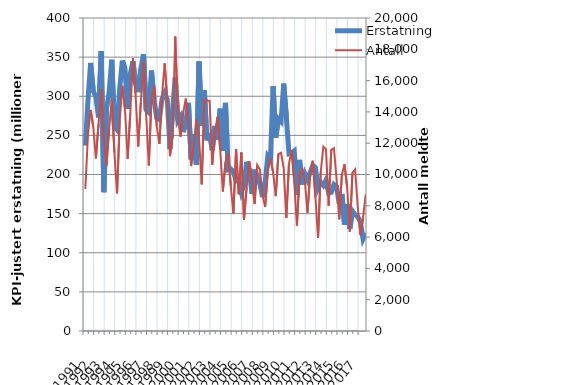
| Category | Erstatning |
|---|---|
| 1991.0 | 236.93 |
| nan | 294.783 |
| nan | 342.604 |
| nan | 306.85 |
| 1992.0 | 298.702 |
| nan | 272.93 |
| nan | 357.674 |
| nan | 177.392 |
| 1993.0 | 282.989 |
| nan | 304.909 |
| nan | 346.657 |
| nan | 261.754 |
| 1994.0 | 257.298 |
| nan | 309.812 |
| nan | 345.57 |
| nan | 335.26 |
| 1995.0 | 283.864 |
| nan | 328.377 |
| nan | 344.843 |
| nan | 315.774 |
| 1996.0 | 305.279 |
| nan | 335.126 |
| nan | 353.585 |
| nan | 282.683 |
| 1997.0 | 279.48 |
| nan | 332.877 |
| nan | 294.639 |
| nan | 272.383 |
| 1998.0 | 270.352 |
| nan | 296.571 |
| nan | 304.109 |
| nan | 295.927 |
| 1999.0 | 232.48 |
| nan | 282.091 |
| nan | 324.198 |
| nan | 268.894 |
| 2000.0 | 274.096 |
| nan | 254.192 |
| nan | 266.636 |
| nan | 291.498 |
| 2001.0 | 219.204 |
| nan | 251.418 |
| nan | 212.311 |
| nan | 344.35 |
| 2002.0 | 262.177 |
| nan | 307.371 |
| nan | 243.755 |
| nan | 253.074 |
| 2003.0 | 231.225 |
| nan | 262.007 |
| nan | 244.31 |
| nan | 284.07 |
| 2004.0 | 230.06 |
| nan | 291.643 |
| nan | 206.052 |
| nan | 206.912 |
| 2005.0 | 203.382 |
| nan | 191.684 |
| nan | 192.48 |
| nan | 177.255 |
| 2006.0 | 187.023 |
| nan | 216.279 |
| nan | 206.275 |
| nan | 175.342 |
| 2007.0 | 206.294 |
| nan | 197.065 |
| nan | 187.945 |
| nan | 171.171 |
| 2008.0 | 190.176 |
| nan | 223.609 |
| nan | 219.141 |
| nan | 313.056 |
| 2009.0 | 246.971 |
| nan | 271.054 |
| nan | 267.661 |
| nan | 316.135 |
| 2010.0 | 273.511 |
| nan | 226.468 |
| nan | 227.397 |
| nan | 230.109 |
| 2011.0 | 174.049 |
| nan | 218.637 |
| nan | 187.211 |
| nan | 200.949 |
| 2012.0 | 193.218 |
| nan | 202.53 |
| nan | 211.663 |
| nan | 208.882 |
| 2013.0 | 182.74 |
| nan | 189.941 |
| nan | 186.037 |
| nan | 192.746 |
| 2014.0 | 176.109 |
| nan | 177.235 |
| nan | 187.111 |
| nan | 184.198 |
| 2015.0 | 162.554 |
| nan | 175.142 |
| nan | 135.952 |
| nan | 162.027 |
| 2016.0 | 130.485 |
| nan | 153.144 |
| nan | 148.639 |
| nan | 145.95 |
| 2017.0 | 139.586 |
| nan | 117.83 |
| nan | 125.266 |